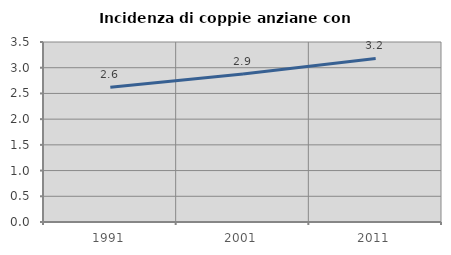
| Category | Incidenza di coppie anziane con figli |
|---|---|
| 1991.0 | 2.622 |
| 2001.0 | 2.877 |
| 2011.0 | 3.18 |